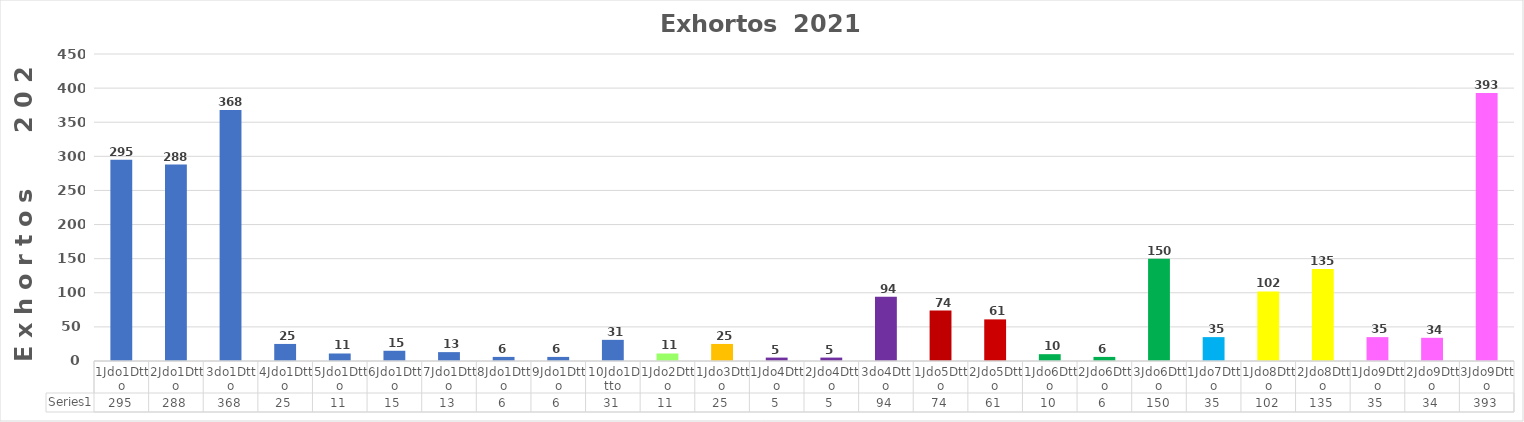
| Category | Series 0 |
|---|---|
| 1Jdo1Dtto | 295 |
| 2Jdo1Dtto | 288 |
| 3do1Dtto | 368 |
| 4Jdo1Dtto | 25 |
| 5Jdo1Dtto | 11 |
| 6Jdo1Dtto | 15 |
| 7Jdo1Dtto | 13 |
| 8Jdo1Dtto | 6 |
| 9Jdo1Dtto | 6 |
| 10Jdo1Dtto | 31 |
| 1Jdo2Dtto | 11 |
| 1Jdo3Dtto | 25 |
| 1Jdo4Dtto | 5 |
| 2Jdo4Dtto | 5 |
| 3do4Dtto | 94 |
| 1Jdo5Dtto | 74 |
| 2Jdo5Dtto | 61 |
| 1Jdo6Dtto | 10 |
| 2Jdo6Dtto | 6 |
| 3Jdo6Dtto | 150 |
| 1Jdo7Dtto | 35 |
| 1Jdo8Dtto | 102 |
| 2Jdo8Dtto | 135 |
| 1Jdo9Dtto | 35 |
| 2Jdo9Dtto | 34 |
| 3Jdo9Dtto | 393 |